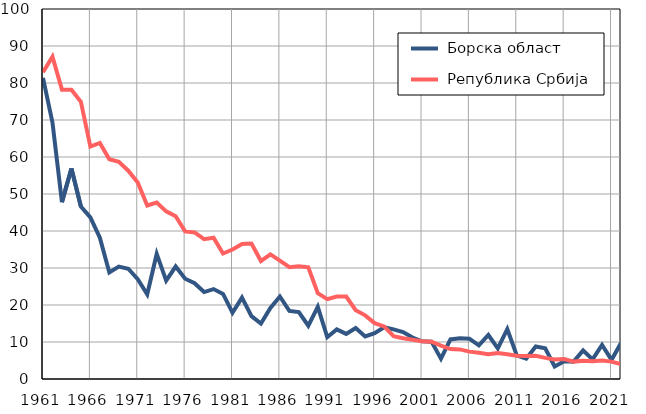
| Category |  Борска област |  Република Србија |
|---|---|---|
| 1961.0 | 81.4 | 82.9 |
| 1962.0 | 69.3 | 87.1 |
| 1963.0 | 47.8 | 78.2 |
| 1964.0 | 56.9 | 78.2 |
| 1965.0 | 46.6 | 74.9 |
| 1966.0 | 43.7 | 62.8 |
| 1967.0 | 38.2 | 63.8 |
| 1968.0 | 28.8 | 59.4 |
| 1969.0 | 30.4 | 58.7 |
| 1970.0 | 29.8 | 56.3 |
| 1971.0 | 27 | 53.1 |
| 1972.0 | 22.9 | 46.9 |
| 1973.0 | 33.8 | 47.7 |
| 1974.0 | 26.6 | 45.3 |
| 1975.0 | 30.4 | 44 |
| 1976.0 | 27.1 | 39.9 |
| 1977.0 | 25.9 | 39.6 |
| 1978.0 | 23.5 | 37.8 |
| 1979.0 | 24.3 | 38.2 |
| 1980.0 | 23 | 33.9 |
| 1981.0 | 17.9 | 35 |
| 1982.0 | 22 | 36.5 |
| 1983.0 | 17 | 36.6 |
| 1984.0 | 15 | 31.9 |
| 1985.0 | 19.2 | 33.7 |
| 1986.0 | 22.3 | 32 |
| 1987.0 | 18.4 | 30.2 |
| 1988.0 | 18.1 | 30.5 |
| 1989.0 | 14.4 | 30.2 |
| 1990.0 | 19.5 | 23.2 |
| 1991.0 | 11.3 | 21.6 |
| 1992.0 | 13.4 | 22.3 |
| 1993.0 | 12.2 | 22.3 |
| 1994.0 | 13.8 | 18.6 |
| 1995.0 | 11.5 | 17.2 |
| 1996.0 | 12.4 | 15.1 |
| 1997.0 | 14 | 14.2 |
| 1998.0 | 13.4 | 11.6 |
| 1999.0 | 12.7 | 11 |
| 2000.0 | 11.2 | 10.6 |
| 2001.0 | 10.2 | 10.2 |
| 2002.0 | 10.1 | 10.1 |
| 2003.0 | 5.5 | 9 |
| 2004.0 | 10.7 | 8.1 |
| 2005.0 | 11 | 8 |
| 2006.0 | 10.9 | 7.4 |
| 2007.0 | 9.1 | 7.1 |
| 2008.0 | 11.9 | 6.7 |
| 2009.0 | 8.3 | 7 |
| 2010.0 | 13.5 | 6.7 |
| 2011.0 | 6.4 | 6.3 |
| 2012.0 | 5.5 | 6.2 |
| 2013.0 | 8.8 | 6.3 |
| 2014.0 | 8.3 | 5.7 |
| 2015.0 | 3.4 | 5.3 |
| 2016.0 | 4.8 | 5.4 |
| 2017.0 | 4.7 | 4.7 |
| 2018.0 | 7.7 | 4.9 |
| 2019.0 | 5.3 | 4.8 |
| 2020.0 | 9.2 | 5 |
| 2021.0 | 5.2 | 4.7 |
| 2022.0 | 9.7 | 4 |